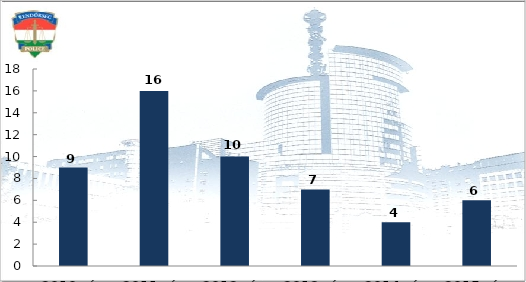
| Category | Ittasan okozott közúti közlekedési balesetek száma |
|---|---|
| 2010. év | 9 |
| 2011. év | 16 |
| 2012. év | 10 |
| 2013. év | 7 |
| 2014. év | 4 |
| 2015. év | 6 |